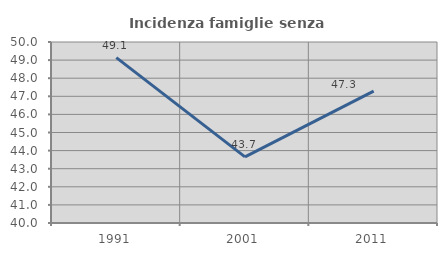
| Category | Incidenza famiglie senza nuclei |
|---|---|
| 1991.0 | 49.136 |
| 2001.0 | 43.651 |
| 2011.0 | 47.287 |